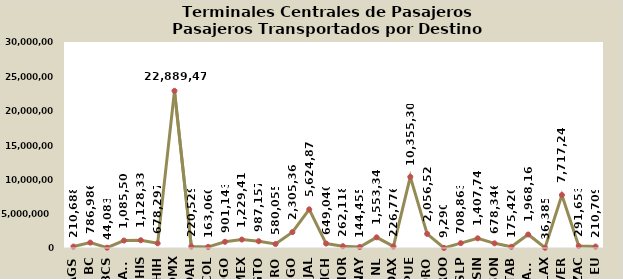
| Category | D e s t i n o s |
|---|---|
| AGS | 210688 |
| BC | 786986 |
| BCS | 44083 |
| CAMP | 1085503 |
| CHIS | 1128335 |
| CHIH | 678297 |
| CDMX | 22889479 |
| COAH | 220529 |
| COL | 163060 |
| DGO | 901143 |
| MEX | 1229418 |
| GTO | 987157 |
| GRO | 580055 |
| HGO | 2305362 |
| JAL | 5624879 |
| MICH | 649040 |
| MOR | 262118 |
| NAY | 144455 |
| NL | 1553340 |
| OAX | 226776 |
| PUE | 10355306 |
| QRO | 2056527 |
| QROO | 9290 |
| SLP | 708863 |
| SIN | 1407749 |
| SON | 678346 |
| TAB | 175420 |
| TAMS | 1968161 |
| TLAX | 36385 |
| VER | 7717241 |
| ZAC | 291653 |
| EU | 210709 |